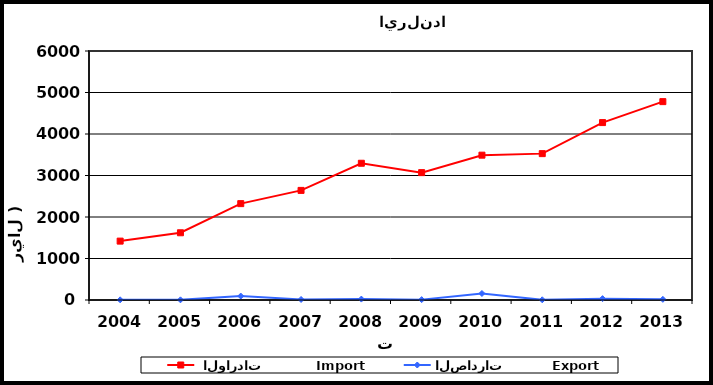
| Category |  الواردات           Import | الصادرات          Export |
|---|---|---|
| 2004.0 | 1419 | 4 |
| 2005.0 | 1620 | 4 |
| 2006.0 | 2322 | 95 |
| 2007.0 | 2641 | 13 |
| 2008.0 | 3295 | 22 |
| 2009.0 | 3069 | 9 |
| 2010.0 | 3490 | 157 |
| 2011.0 | 3527 | 5 |
| 2012.0 | 4275 | 33 |
| 2013.0 | 4780 | 16 |